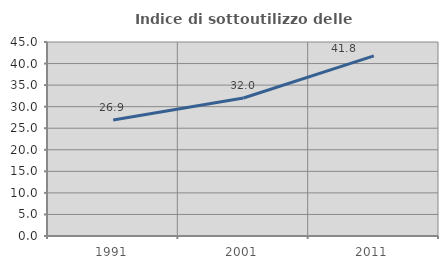
| Category | Indice di sottoutilizzo delle abitazioni  |
|---|---|
| 1991.0 | 26.928 |
| 2001.0 | 32.007 |
| 2011.0 | 41.795 |